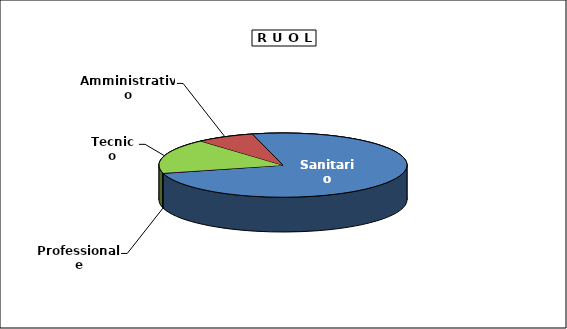
| Category | Personale |
|---|---|
| Professionale | 895 |
| Tecnico | 94896 |
| Amministrativo | 41053 |
| Sanitario | 406672 |